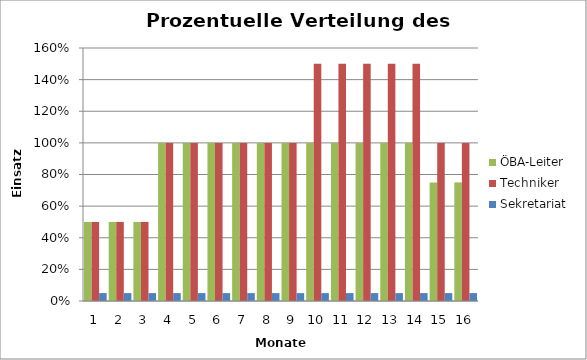
| Category | ÖBA-Leiter | Techniker | Sekretariat |
|---|---|---|---|
| 0 | 0.5 | 0.5 | 0.05 |
| 1 | 0.5 | 0.5 | 0.05 |
| 2 | 0.5 | 0.5 | 0.05 |
| 3 | 1 | 1 | 0.05 |
| 4 | 1 | 1 | 0.05 |
| 5 | 1 | 1 | 0.05 |
| 6 | 1 | 1 | 0.05 |
| 7 | 1 | 1 | 0.05 |
| 8 | 1 | 1 | 0.05 |
| 9 | 1 | 1.5 | 0.05 |
| 10 | 1 | 1.5 | 0.05 |
| 11 | 1 | 1.5 | 0.05 |
| 12 | 1 | 1.5 | 0.05 |
| 13 | 1 | 1.5 | 0.05 |
| 14 | 0.75 | 1 | 0.05 |
| 15 | 0.75 | 1 | 0.05 |